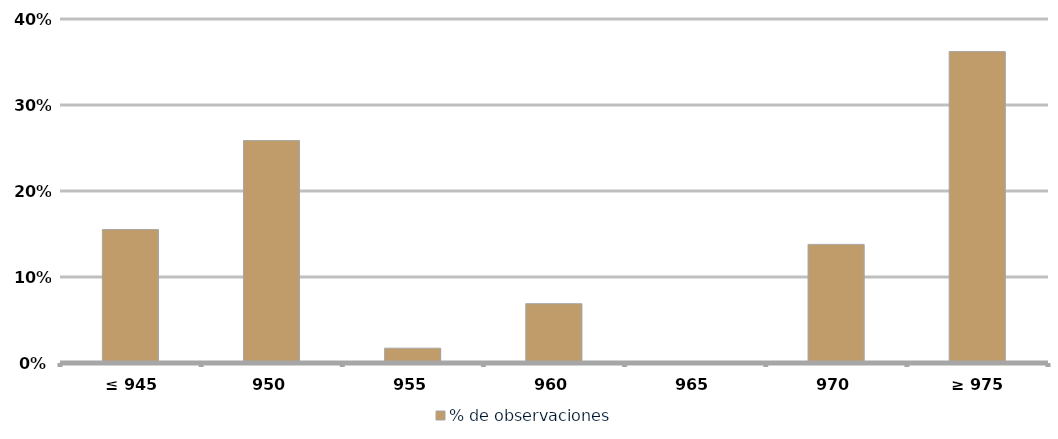
| Category | % de observaciones  |
|---|---|
|  ≤ 945  | 0.155 |
|  950  | 0.259 |
|  955  | 0.017 |
|  960  | 0.069 |
|  965  | 0 |
| 970 | 0.138 |
|  ≥ 975  | 0.362 |